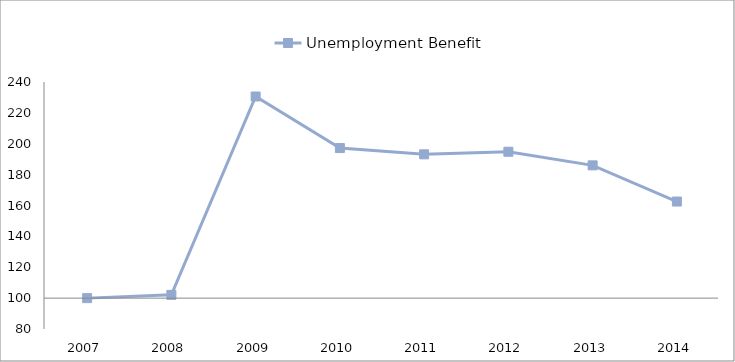
| Category | Unemployment Benefit |   | 0 |
|---|---|---|---|
| 2007.0 | 100 |  |  |
| 2008.0 | 102.108 |  |  |
| 2009.0 | 230.607 |  |  |
| 2010.0 | 197.2 |  |  |
| 2011.0 | 193.142 |  |  |
| 2012.0 | 194.827 |  |  |
| 2013.0 | 185.993 |  |  |
| 2014.0 | 162.566 |  |  |